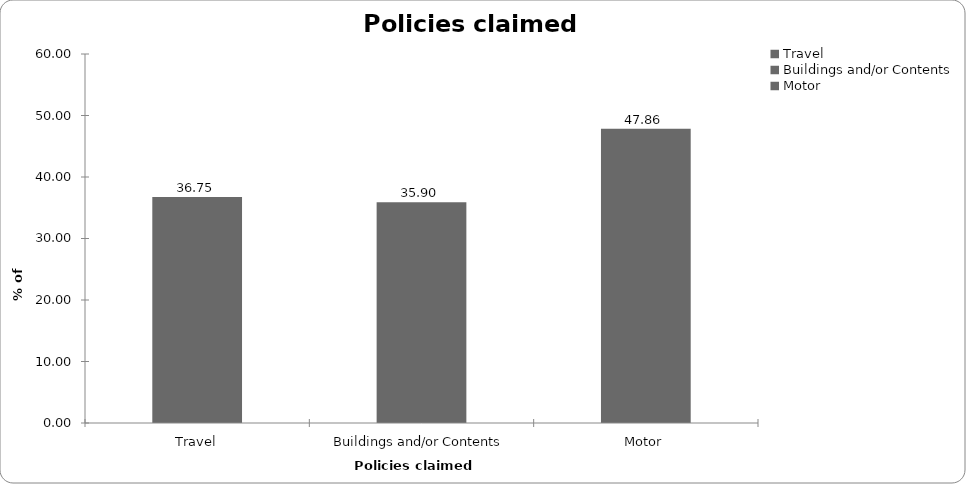
| Category | Policies claimed on |
|---|---|
| Travel | 36.752 |
| Buildings and/or Contents | 35.897 |
| Motor | 47.863 |